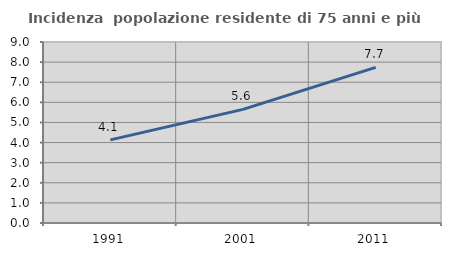
| Category | Incidenza  popolazione residente di 75 anni e più |
|---|---|
| 1991.0 | 4.133 |
| 2001.0 | 5.649 |
| 2011.0 | 7.738 |